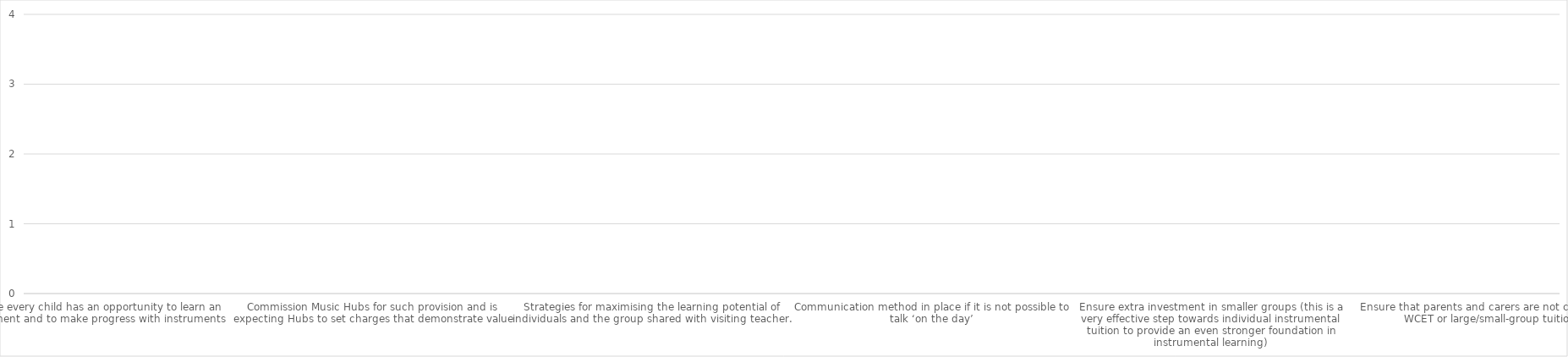
| Category | Series 0 |
|---|---|
| Ensure every child has an opportunity to learn an instrument and to make progress with instruments | 0 |
| Offer group instrumental teaching programmes in class time – either WCET or large/small-group tuition | 0 |
| Commission Music Hubs for such provision and is expecting Hubs to set charges that demonstrate value | 0 |
| Visiting music teacher briefed about SEND within the class and guided on appropriate management of pupils – e.g.STEPS school | 0 |
| Strategies for maximising the learning potential of individuals and the group shared with visiting teacher. | 0 |
| Beginning of year and end of year check in with the FA teacher | 0 |
| Communication method in place if it is not possible to talk ‘on the day’ | 0 |
| Expect high-quality lessons from specialist tutors and is challenging poor teaching practice in dialogue with providers and Hub lead organisations where necessary | 0 |
| Ensure extra investment in smaller groups (this is a very effective step towards individual instrumental tuition to provide an even stronger foundation in instrumental learning) | 0 |
| Ensure all children in the class take part | 0 |
| Ensure that parents and carers are not charged for WCET or large/small-group tuition | 0 |